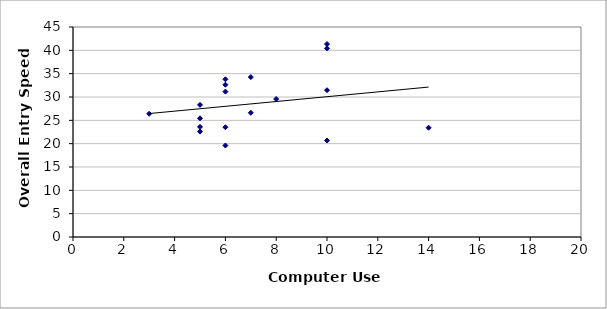
| Category | Series 0 |
|---|---|
| 6.0 | 31.156 |
| 10.0 | 20.679 |
| 6.0 | 23.518 |
| 10.0 | 41.356 |
| 3.0 | 26.406 |
| 5.0 | 23.586 |
| 5.0 | 25.44 |
| 6.0 | 19.61 |
| 10.0 | 40.428 |
| 6.0 | 32.638 |
| 14.0 | 23.417 |
| 5.0 | 28.308 |
| 6.0 | 33.8 |
| 8.0 | 29.57 |
| 7.0 | 26.615 |
| 5.0 | 22.595 |
| 7.0 | 34.265 |
| 10.0 | 31.454 |